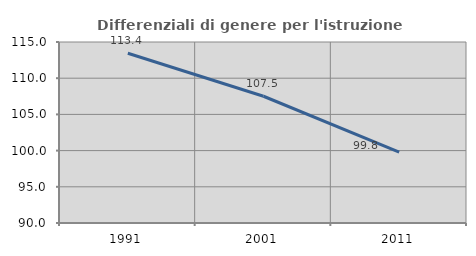
| Category | Differenziali di genere per l'istruzione superiore |
|---|---|
| 1991.0 | 113.442 |
| 2001.0 | 107.507 |
| 2011.0 | 99.79 |